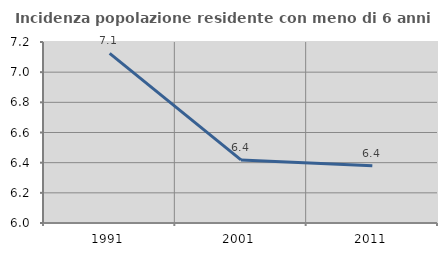
| Category | Incidenza popolazione residente con meno di 6 anni |
|---|---|
| 1991.0 | 7.125 |
| 2001.0 | 6.418 |
| 2011.0 | 6.38 |